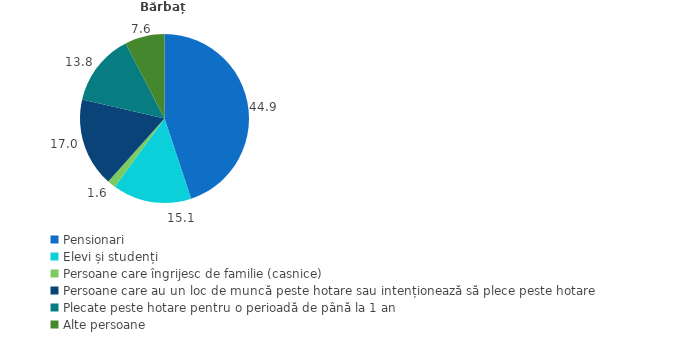
| Category | Bărbați |
|---|---|
| Pensionari | 44.9 |
| Elevi și studenți | 15.1 |
| Persoane care îngrijesc de familie (casnice) | 1.6 |
| Persoane care au un loc de muncă peste hotare sau intenționează să plece peste hotare | 17 |
| Plecate peste hotare pentru o perioadă de până la 1 an | 13.8 |
| Alte persoane | 7.6 |